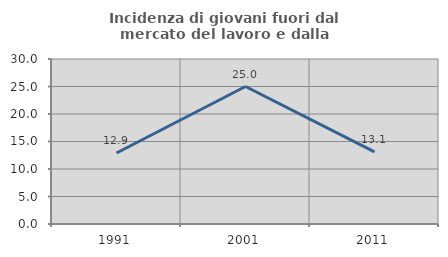
| Category | Incidenza di giovani fuori dal mercato del lavoro e dalla formazione  |
|---|---|
| 1991.0 | 12.903 |
| 2001.0 | 25 |
| 2011.0 | 13.115 |